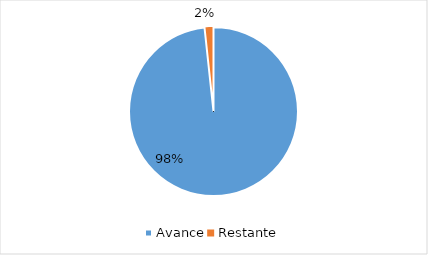
| Category | Series 0 |
|---|---|
| Avance | 0.983 |
| Restante | 0.017 |